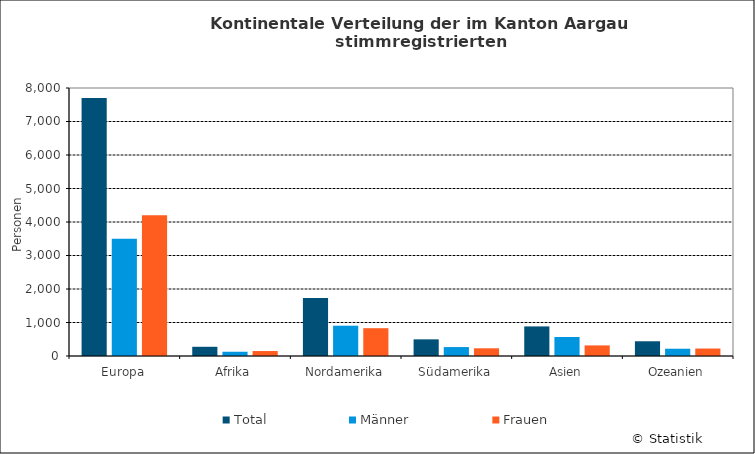
| Category | Total | Männer | Frauen |
|---|---|---|---|
| Europa | 7700 | 3498 | 4202 |
| Afrika | 275 | 127 | 148 |
| Nordamerika | 1734 | 904 | 830 |
| Südamerika | 497 | 267 | 230 |
| Asien | 883 | 567 | 316 |
| Ozeanien | 440 | 217 | 223 |